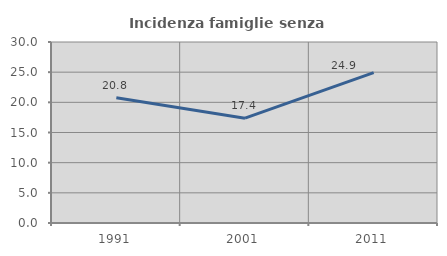
| Category | Incidenza famiglie senza nuclei |
|---|---|
| 1991.0 | 20.759 |
| 2001.0 | 17.376 |
| 2011.0 | 24.917 |